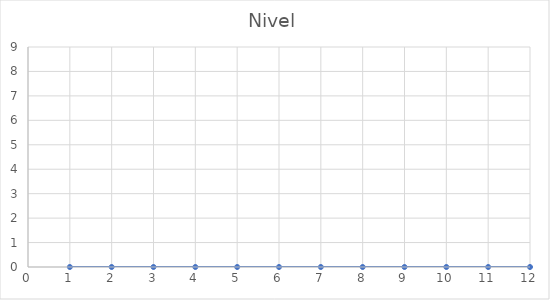
| Category | Nivel |
|---|---|
| 0 | 0 |
| 1 | 0 |
| 2 | 0 |
| 3 | 0 |
| 4 | 0 |
| 5 | 0 |
| 6 | 0 |
| 7 | 0 |
| 8 | 0 |
| 9 | 0 |
| 10 | 0 |
| 11 | 0 |